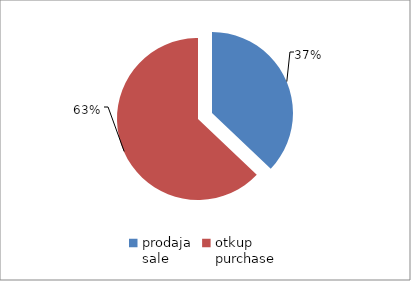
| Category | Series 0 |
|---|---|
| prodaja
sale | 12701074 |
| otkup
purchase | 21549552.9 |